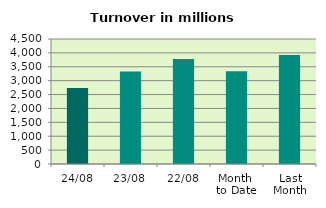
| Category | Series 0 |
|---|---|
| 24/08 | 2735.074 |
| 23/08 | 3329.463 |
| 22/08 | 3782.341 |
| Month 
to Date | 3335.721 |
| Last
Month | 3920.999 |